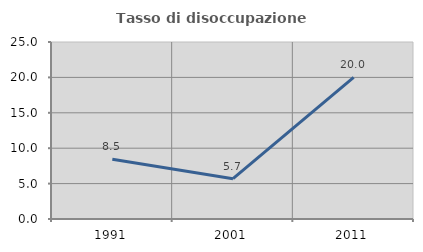
| Category | Tasso di disoccupazione giovanile  |
|---|---|
| 1991.0 | 8.451 |
| 2001.0 | 5.691 |
| 2011.0 | 20 |